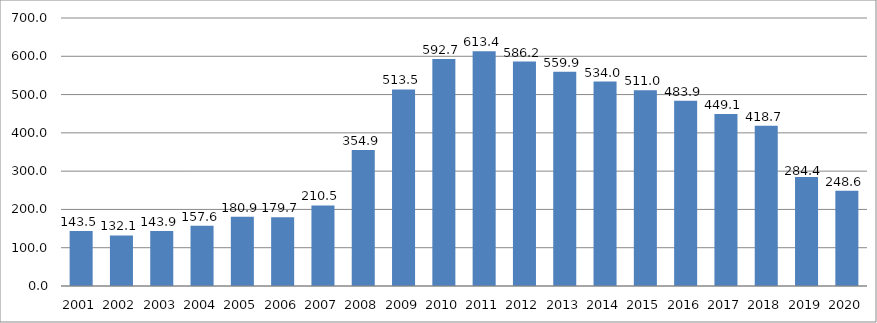
| Category | Disbursed Outstanding Debt |
|---|---|
| 2001.0 | 143.5 |
| 2002.0 | 132.1 |
| 2003.0 | 143.9 |
| 2004.0 | 157.6 |
| 2005.0 | 180.9 |
| 2006.0 | 179.7 |
| 2007.0 | 210.5 |
| 2008.0 | 354.9 |
| 2009.0 | 513.5 |
| 2010.0 | 592.7 |
| 2011.0 | 613.4 |
| 2012.0 | 586.2 |
| 2013.0 | 559.9 |
| 2014.0 | 534 |
| 2015.0 | 511 |
| 2016.0 | 483.868 |
| 2017.0 | 449.148 |
| 2018.0 | 418.664 |
| 2019.0 | 284.381 |
| 2020.0 | 248.556 |